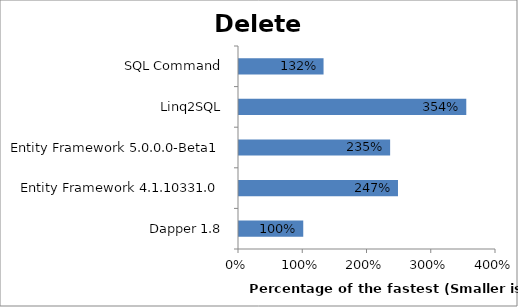
| Category | Series 0 |
|---|---|
| Dapper 1.8 | 1 |
| Entity Framework 4.1.10331.0 | 2.475 |
| Entity Framework 5.0.0.0-Beta1 | 2.352 |
| Linq2SQL | 3.537 |
| SQL Command | 1.316 |